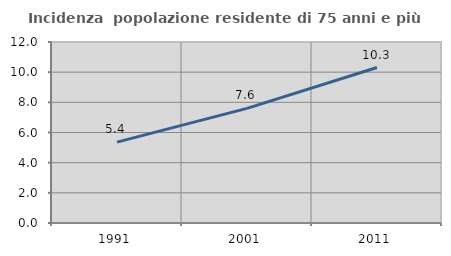
| Category | Incidenza  popolazione residente di 75 anni e più |
|---|---|
| 1991.0 | 5.363 |
| 2001.0 | 7.599 |
| 2011.0 | 10.309 |